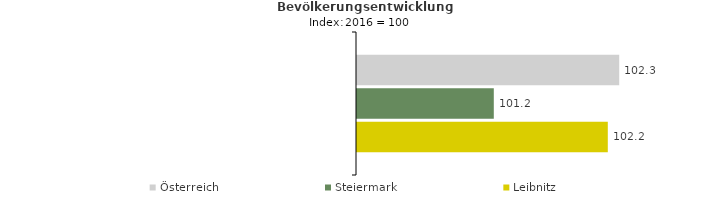
| Category | Österreich | Steiermark | Leibnitz |
|---|---|---|---|
| 2020.0 | 102.3 | 101.2 | 102.2 |